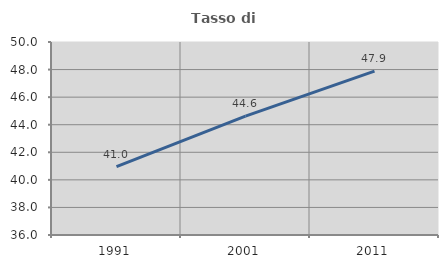
| Category | Tasso di occupazione   |
|---|---|
| 1991.0 | 40.953 |
| 2001.0 | 44.627 |
| 2011.0 | 47.892 |